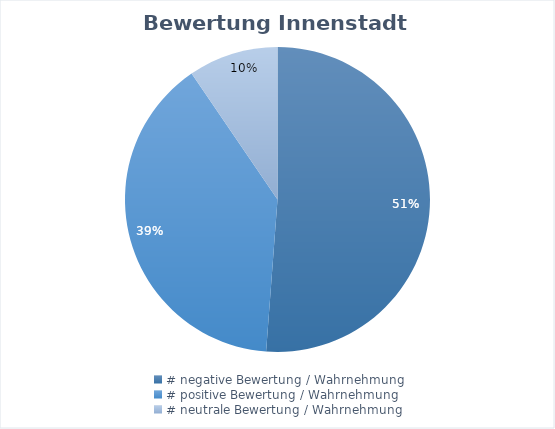
| Category | Series 0 |
|---|---|
| # negative Bewertung / Wahrnehmung | 43 |
| # positive Bewertung / Wahrnehmung | 33 |
| # neutrale Bewertung / Wahrnehmung | 8 |